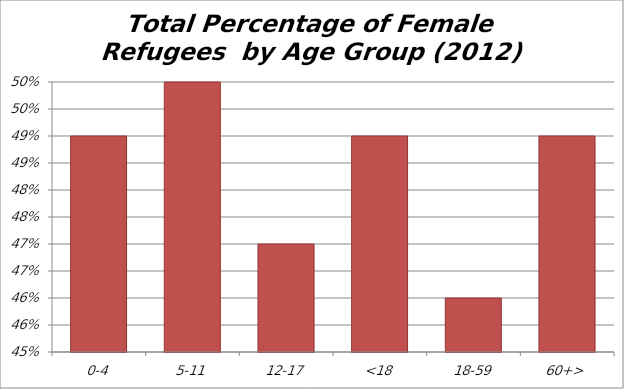
| Category | Total |
|---|---|
| 0-4 | 0.49 |
| 5-11 | 0.5 |
| 12-17 | 0.47 |
| <18 | 0.49 |
| 18-59 | 0.46 |
| 60+> | 0.49 |